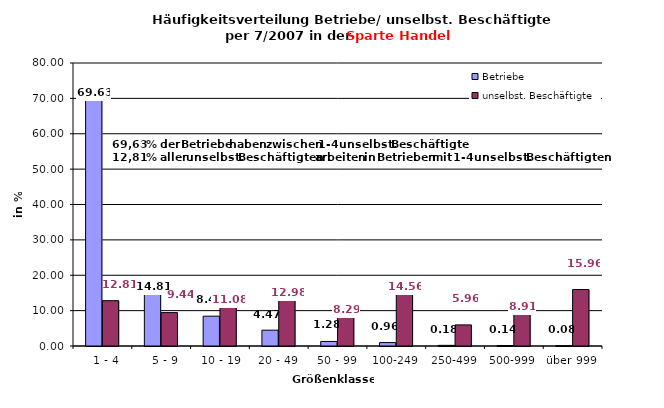
| Category | Betriebe | unselbst. Beschäftigte |
|---|---|---|
|   1 - 4 | 69.634 | 12.814 |
|   5 - 9 | 14.81 | 9.442 |
|  10 - 19 | 8.432 | 11.077 |
| 20 - 49 | 4.474 | 12.978 |
| 50 - 99 | 1.285 | 8.29 |
| 100-249 | 0.964 | 14.565 |
| 250-499 | 0.184 | 5.961 |
| 500-999 | 0.138 | 8.912 |
| über 999 | 0.08 | 15.96 |